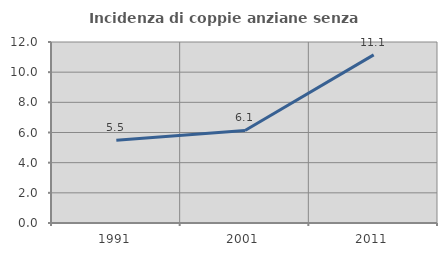
| Category | Incidenza di coppie anziane senza figli  |
|---|---|
| 1991.0 | 5.491 |
| 2001.0 | 6.135 |
| 2011.0 | 11.149 |